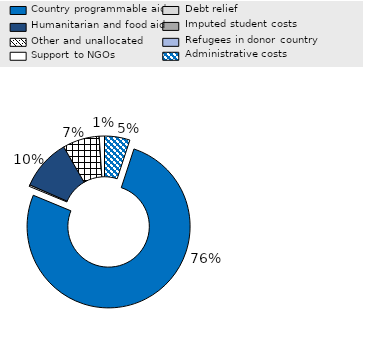
| Category | Series 0 |
|---|---|
| Administrative costs | 0.05 |
| Country programmable aid | 0.762 |
| Debt relief | 0.003 |
| Humanitarian and food aid | 0.101 |
| Imputed student costs | 0 |
| Other and unallocated | 0.073 |
| Refugees in donor country | 0 |
| Support to NGOs | 0.01 |